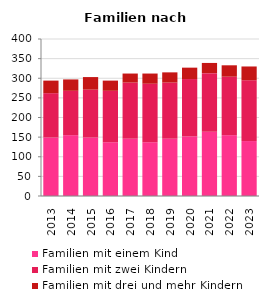
| Category | Familien mit einem Kind | Familien mit zwei Kindern | Familien mit drei und mehr Kindern |
|---|---|---|---|
| 2013.0 | 149 | 113 | 32 |
| 2014.0 | 155 | 113 | 29 |
| 2015.0 | 149 | 122 | 32 |
| 2016.0 | 137 | 131 | 26 |
| 2017.0 | 146 | 143 | 23 |
| 2018.0 | 137 | 149 | 26 |
| 2019.0 | 146 | 143 | 26 |
| 2020.0 | 152 | 146 | 29 |
| 2021.0 | 164 | 149 | 26 |
| 2022.0 | 155 | 149 | 29 |
| 2023.0 | 140 | 155 | 35 |